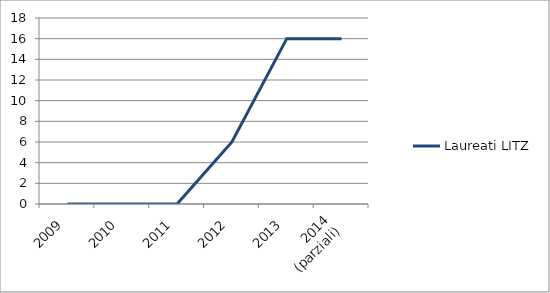
| Category | Laureati LITZ |
|---|---|
| 2009 | 0 |
| 2010 | 0 |
| 2011 | 0 |
| 2012 | 6 |
| 2013 | 16 |
| 2014
(parziali) | 16 |